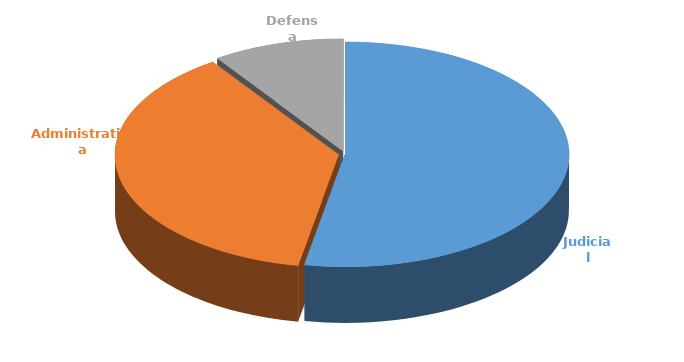
| Category | Cantidad |
|---|---|
| Judicial | 328 |
| Administrativa | 233 |
| Defensa | 59 |